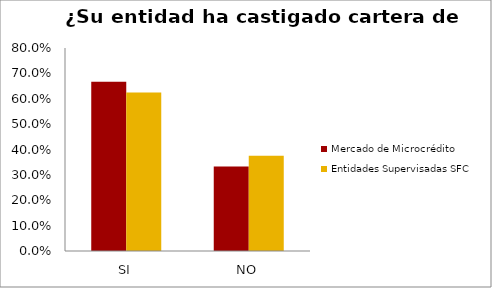
| Category | Mercado de Microcrédito | Entidades Supervisadas SFC |
|---|---|---|
| SI | 0.667 | 0.625 |
| NO | 0.333 | 0.375 |